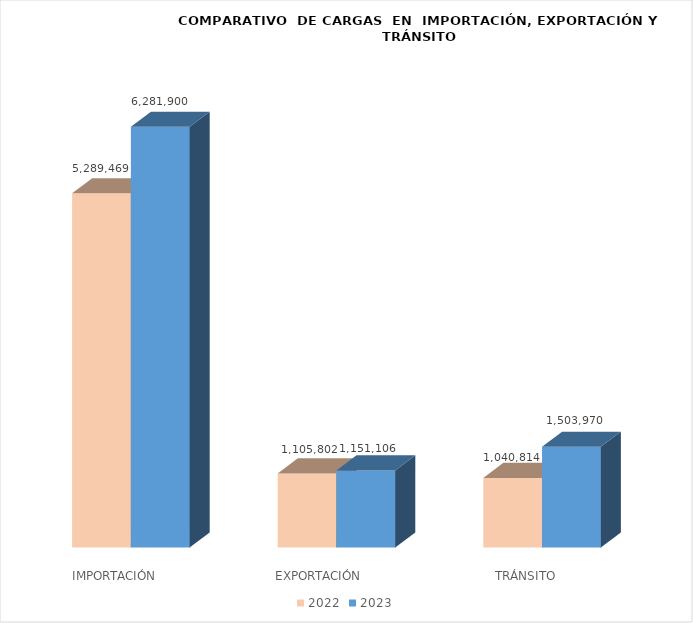
| Category | 2022 | 2023 |
|---|---|---|
| IMPORTACIÓN | 5289469 | 6281899.79 |
| EXPORTACIÓN  | 1105802 | 1151105.8 |
| TRÁNSITO | 1040814 | 1503970 |